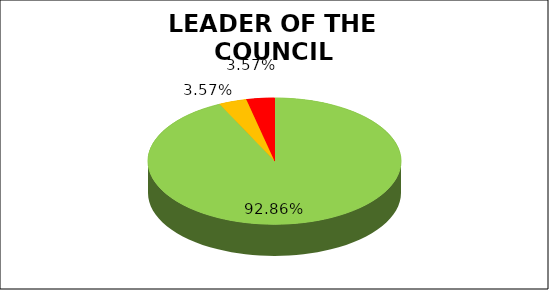
| Category | Series 0 |
|---|---|
| Green | 0.929 |
| Amber | 0.036 |
| Red | 0.036 |